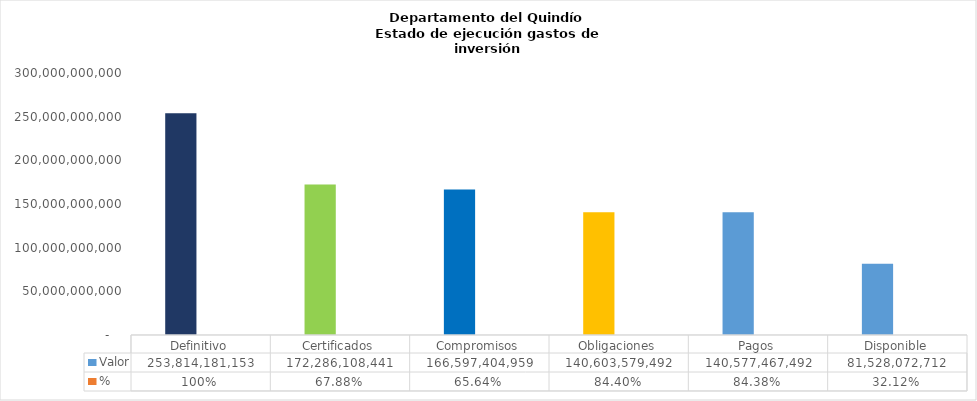
| Category | Valor | % |
|---|---|---|
| Definitivo | 253814181153.08 | 1 |
| Certificados | 172286108441.49 | 0.679 |
| Compromisos | 166597404958.9 | 0.656 |
| Obligaciones | 140603579492.12 | 0.844 |
| Pagos | 140577467492.12 | 0.844 |
|  Disponible  | 81528072711.59 | 0.321 |